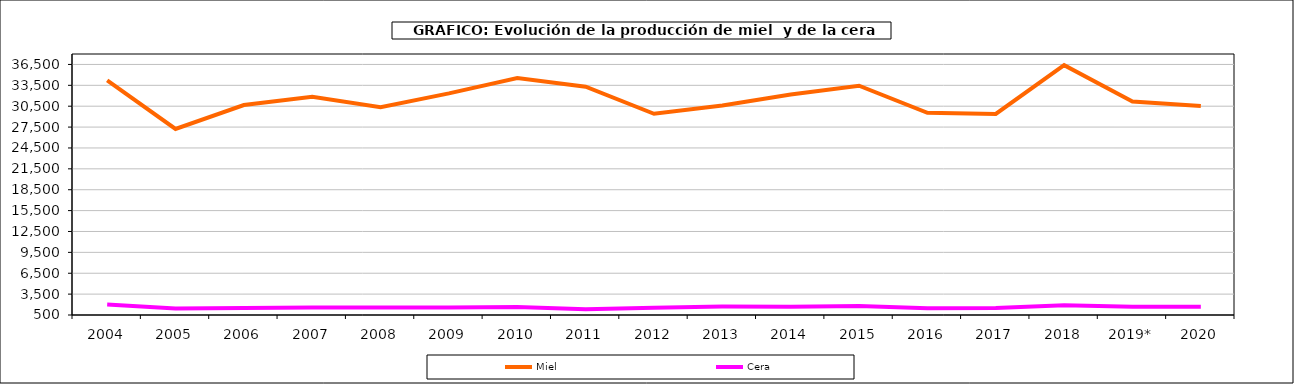
| Category | Miel | Cera |
|---|---|---|
| 2004 | 34211.281 | 2012.912 |
| 2005 | 27229.804 | 1449.87 |
| 2006 | 30661.002 | 1522.368 |
| 2007 | 31840.043 | 1567.556 |
| 2008 | 30361.319 | 1574.535 |
| 2009 | 32336.448 | 1577.669 |
| 2010 | 34550 | 1649 |
| 2011 | 33298.2 | 1325.9 |
| 2012 | 29405 | 1533.9 |
| 2013 | 30612.761 | 1711.558 |
| 2014 | 32174.268 | 1688.302 |
| 2015 | 33440.771 | 1801.65 |
| 2016 | 29545.284 | 1472.699 |
| 2017 | 29393.153 | 1519.363 |
| 2018 | 36393.995 | 1903.773 |
| 2019* | 31160.769 | 1673.824 |
| 2020 | 30512.727 | 1687.065 |